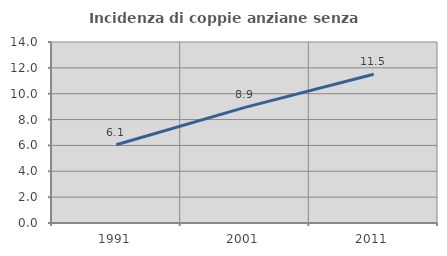
| Category | Incidenza di coppie anziane senza figli  |
|---|---|
| 1991.0 | 6.051 |
| 2001.0 | 8.946 |
| 2011.0 | 11.501 |